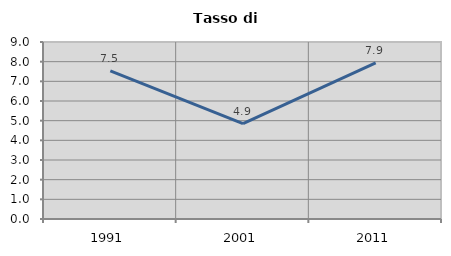
| Category | Tasso di disoccupazione   |
|---|---|
| 1991.0 | 7.531 |
| 2001.0 | 4.854 |
| 2011.0 | 7.944 |